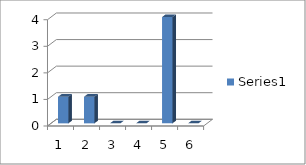
| Category | Series 0 |
|---|---|
| 0 | 1 |
| 1 | 1 |
| 2 | 0 |
| 3 | 0 |
| 4 | 4 |
| 5 | 0 |